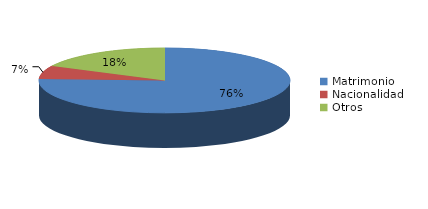
| Category | Series 0 |
|---|---|
| Matrimonio | 1544 |
| Nacionalidad | 136 |
| Otros | 360 |